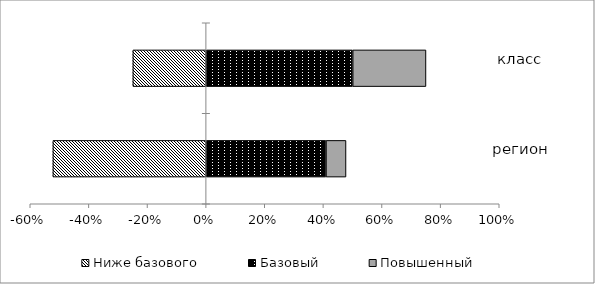
| Category | Ниже базового | Базовый | Повышенный |
|---|---|---|---|
|  | -0.523 | 0.409 | 0.068 |
|  | -0.25 | 0.5 | 0.25 |